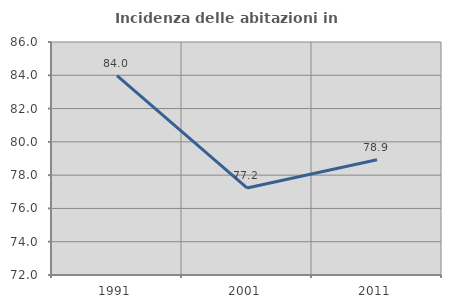
| Category | Incidenza delle abitazioni in proprietà  |
|---|---|
| 1991.0 | 83.983 |
| 2001.0 | 77.232 |
| 2011.0 | 78.926 |